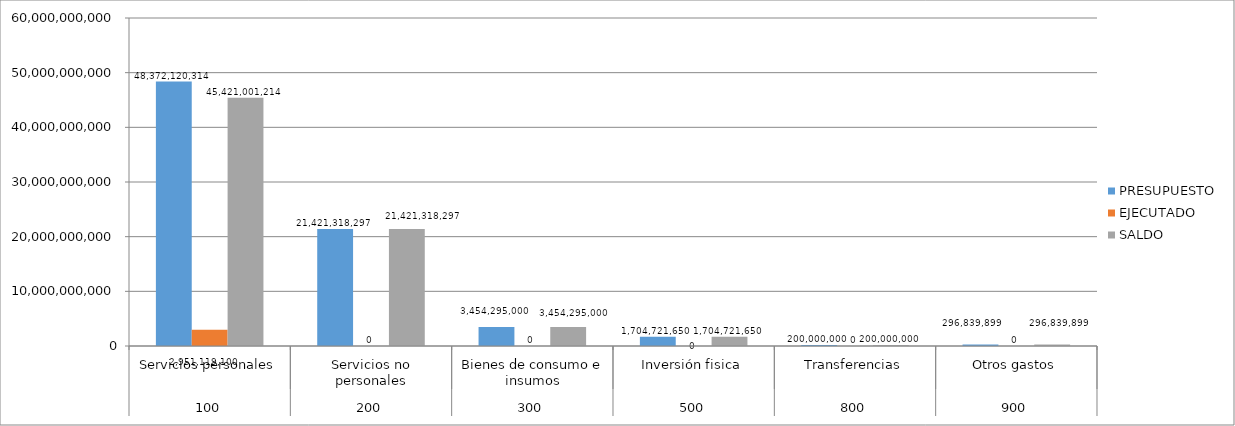
| Category | PRESUPUESTO | EJECUTADO | SALDO |
|---|---|---|---|
| 0 | 48372120314 | 2951119100 | 45421001214 |
| 1 | 21421318297 | 0 | 21421318297 |
| 2 | 3454295000 | 0 | 3454295000 |
| 3 | 1704721650 | 0 | 1704721650 |
| 4 | 200000000 | 0 | 200000000 |
| 5 | 296839899 | 0 | 296839899 |